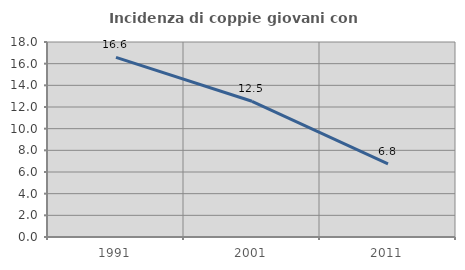
| Category | Incidenza di coppie giovani con figli |
|---|---|
| 1991.0 | 16.587 |
| 2001.0 | 12.528 |
| 2011.0 | 6.754 |